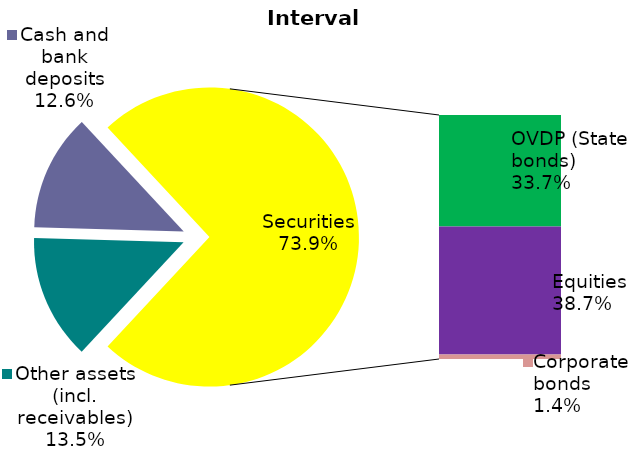
| Category | Series 0 |
|---|---|
| Other assets (incl. receivables) | 0.135 |
| Cash and bank deposits | 0.126 |
| OVDP (State bonds) | 0.337 |
| Equities | 0.387 |
| Corporate bonds | 0.014 |